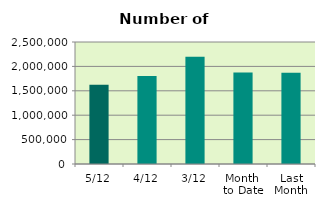
| Category | Series 0 |
|---|---|
| 5/12 | 1622952 |
| 4/12 | 1801550 |
| 3/12 | 2195608 |
| Month 
to Date | 1873370 |
| Last
Month | 1871523.909 |